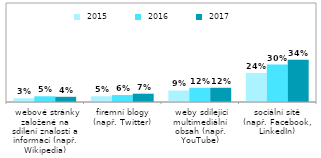
| Category |  2015 |  2016 |  2017 |
|---|---|---|---|
|  webové stránky založené na sdílení znalostí a informací (např. Wikipedia) | 0.03 | 0.046 | 0.042 |
|  firemní blogy 
(např. Twitter) | 0.046 | 0.056 | 0.067 |
|  weby sdílející multimediální obsah (např. YouTube) | 0.093 | 0.115 | 0.115 |
|  sociální sítě 
(např. Facebook, LinkedIn) | 0.235 | 0.303 | 0.341 |